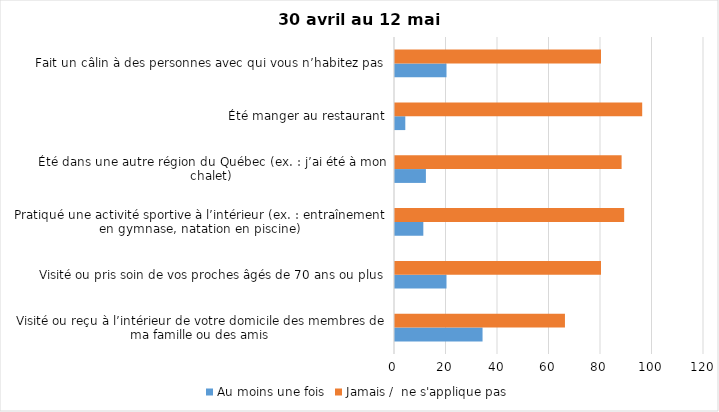
| Category | Au moins une fois | Jamais /  ne s'applique pas |
|---|---|---|
| Visité ou reçu à l’intérieur de votre domicile des membres de ma famille ou des amis | 34 | 66 |
| Visité ou pris soin de vos proches âgés de 70 ans ou plus | 20 | 80 |
| Pratiqué une activité sportive à l’intérieur (ex. : entraînement en gymnase, natation en piscine) | 11 | 89 |
| Été dans une autre région du Québec (ex. : j’ai été à mon chalet) | 12 | 88 |
| Été manger au restaurant | 4 | 96 |
| Fait un câlin à des personnes avec qui vous n’habitez pas | 20 | 80 |